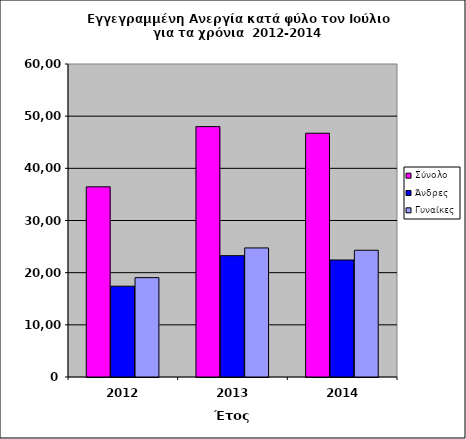
| Category | Σύνολο | Άνδρες  | Γυναίκες  |
|---|---|---|---|
| 2012.0 | 36452 | 17405 | 19047 |
| 2013.0 | 48001 | 23259 | 24742 |
| 2014.0 | 46727 | 22431 | 24296 |